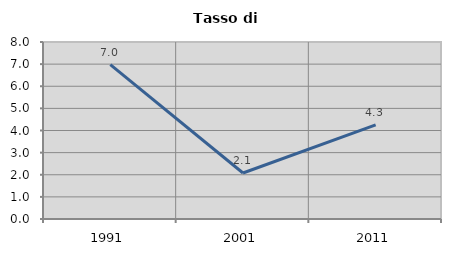
| Category | Tasso di disoccupazione   |
|---|---|
| 1991.0 | 6.977 |
| 2001.0 | 2.078 |
| 2011.0 | 4.251 |